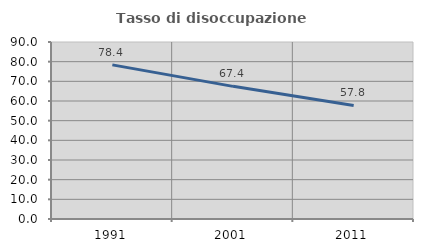
| Category | Tasso di disoccupazione giovanile  |
|---|---|
| 1991.0 | 78.367 |
| 2001.0 | 67.446 |
| 2011.0 | 57.761 |